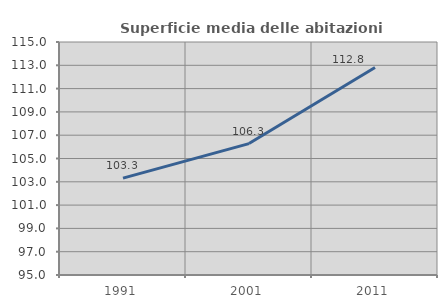
| Category | Superficie media delle abitazioni occupate |
|---|---|
| 1991.0 | 103.314 |
| 2001.0 | 106.28 |
| 2011.0 | 112.805 |